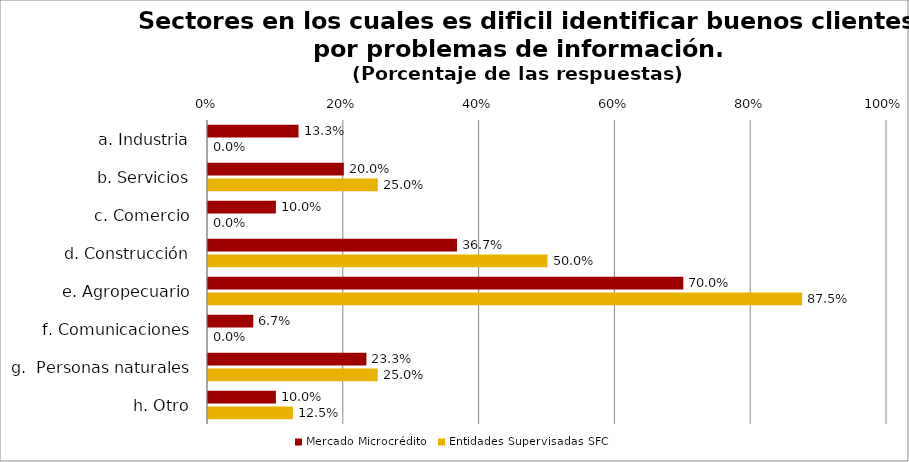
| Category | Mercado Microcrédito | Entidades Supervisadas SFC |
|---|---|---|
| a. Industria | 0.133 | 0 |
| b. Servicios | 0.2 | 0.25 |
| c. Comercio | 0.1 | 0 |
| d. Construcción | 0.367 | 0.5 |
| e. Agropecuario | 0.7 | 0.875 |
| f. Comunicaciones | 0.067 | 0 |
| g.  Personas naturales | 0.233 | 0.25 |
| h. Otro | 0.1 | 0.125 |